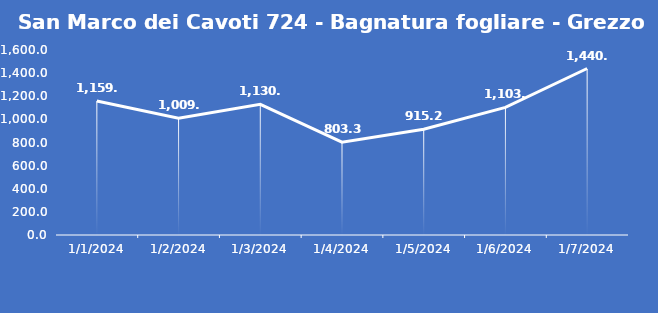
| Category | San Marco dei Cavoti 724 - Bagnatura fogliare - Grezzo (min) |
|---|---|
| 1/1/24 | 1159.4 |
| 1/2/24 | 1009.8 |
| 1/3/24 | 1130.3 |
| 1/4/24 | 803.3 |
| 1/5/24 | 915.2 |
| 1/6/24 | 1103.9 |
| 1/7/24 | 1440 |